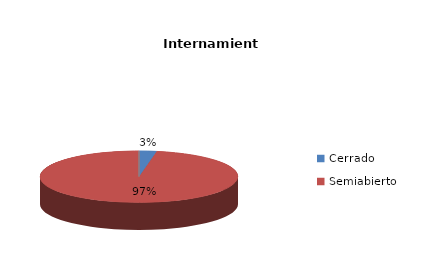
| Category | Series 0 |
|---|---|
| Cerrado | 1 |
| Semiabierto | 34 |
| Abierto | 0 |
| Terapeúticos | 0 |